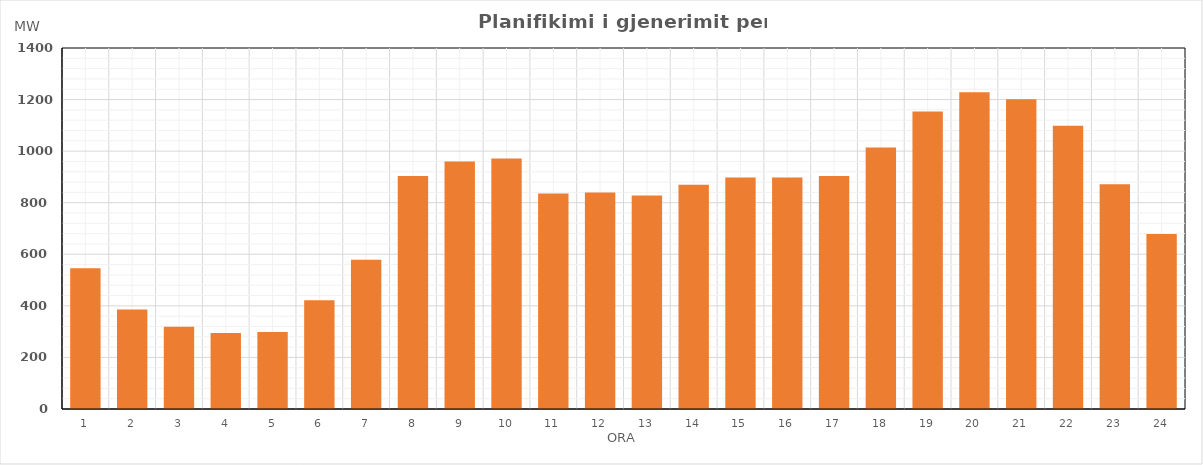
| Category | Max (MW) |
|---|---|
| 0 | 546.2 |
| 1 | 385.77 |
| 2 | 318.67 |
| 3 | 295.07 |
| 4 | 298.67 |
| 5 | 421.47 |
| 6 | 578.72 |
| 7 | 903.33 |
| 8 | 960.04 |
| 9 | 971.02 |
| 10 | 835.4 |
| 11 | 839.41 |
| 12 | 827.51 |
| 13 | 869.3 |
| 14 | 897.69 |
| 15 | 897.38 |
| 16 | 903.37 |
| 17 | 1013.89 |
| 18 | 1154.01 |
| 19 | 1228.48 |
| 20 | 1200.88 |
| 21 | 1098.86 |
| 22 | 871.46 |
| 23 | 678.48 |